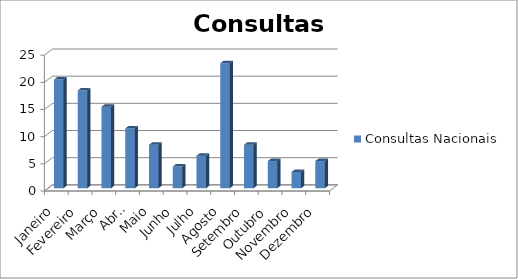
| Category | Consultas Nacionais |
|---|---|
| Janeiro | 20 |
| Fevereiro | 18 |
| Março | 15 |
| Abril | 11 |
| Maio | 8 |
| Junho | 4 |
| Julho | 6 |
| Agosto | 23 |
| Setembro | 8 |
| Outubro | 5 |
| Novembro | 3 |
| Dezembro | 5 |